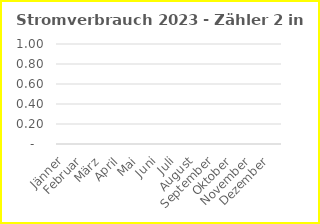
| Category | Verbrauch |
|---|---|
| Jänner | 0 |
| Februar | 0 |
| März | 0 |
| April | 0 |
| Mai | 0 |
| Juni | 0 |
| Juli | 0 |
| August | 0 |
| September | 0 |
| Oktober | 0 |
| November | 0 |
| Dezember | 0 |